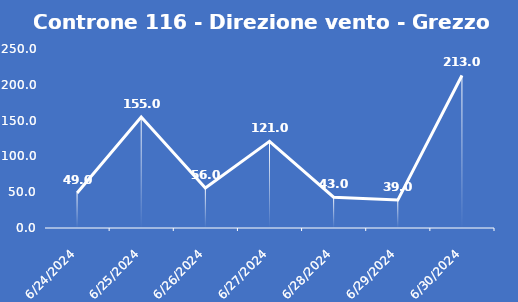
| Category | Controne 116 - Direzione vento - Grezzo (°N) |
|---|---|
| 6/24/24 | 49 |
| 6/25/24 | 155 |
| 6/26/24 | 56 |
| 6/27/24 | 121 |
| 6/28/24 | 43 |
| 6/29/24 | 39 |
| 6/30/24 | 213 |